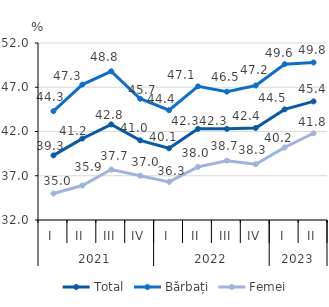
| Category | Total | Bărbați | Femei |
|---|---|---|---|
| 0 | 39.3 | 44.3 | 35 |
| 1 | 41.2 | 47.3 | 35.9 |
| 2 | 42.8 | 48.8 | 37.7 |
| 3 | 41 | 45.7 | 37 |
| 4 | 40.1 | 44.4 | 36.3 |
| 5 | 42.3 | 47.1 | 38 |
| 6 | 42.3 | 46.5 | 38.7 |
| 7 | 42.4 | 47.2 | 38.3 |
| 8 | 44.5 | 49.6 | 40.2 |
| 9 | 45.4 | 49.8 | 41.8 |